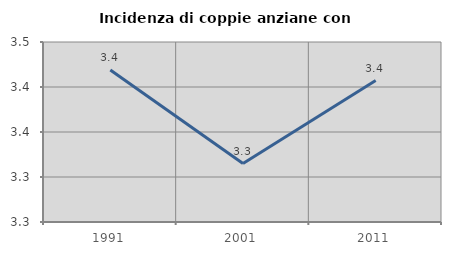
| Category | Incidenza di coppie anziane con figli |
|---|---|
| 1991.0 | 3.419 |
| 2001.0 | 3.315 |
| 2011.0 | 3.407 |